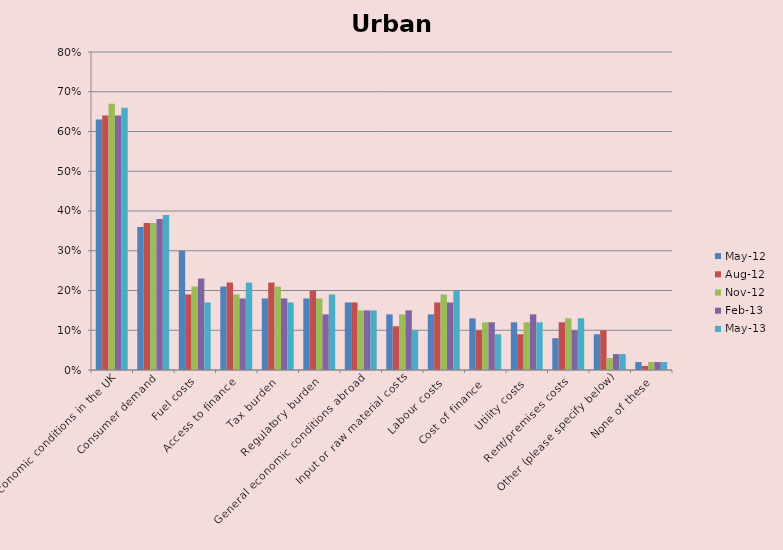
| Category | May-12 | Aug-12 | Nov-12 | Feb-13 | May-13 |
|---|---|---|---|---|---|
| General economic conditions in the UK  | 0.63 | 0.64 | 0.67 | 0.64 | 0.66 |
| Consumer demand | 0.36 | 0.37 | 0.37 | 0.38 | 0.39 |
| Fuel costs | 0.3 | 0.19 | 0.21 | 0.23 | 0.17 |
| Access to finance | 0.21 | 0.22 | 0.19 | 0.18 | 0.22 |
| Tax burden | 0.18 | 0.22 | 0.21 | 0.18 | 0.17 |
| Regulatory burden | 0.18 | 0.2 | 0.18 | 0.14 | 0.19 |
| General economic conditions abroad  | 0.17 | 0.17 | 0.15 | 0.15 | 0.15 |
| Input or raw material costs | 0.14 | 0.11 | 0.14 | 0.15 | 0.1 |
| Labour costs | 0.14 | 0.17 | 0.19 | 0.17 | 0.2 |
| Cost of finance  | 0.13 | 0.1 | 0.12 | 0.12 | 0.09 |
| Utility costs | 0.12 | 0.09 | 0.12 | 0.14 | 0.12 |
| Rent/premises costs | 0.08 | 0.12 | 0.13 | 0.1 | 0.13 |
| Other (please specify below) | 0.09 | 0.1 | 0.03 | 0.04 | 0.04 |
| None of these | 0.02 | 0.01 | 0.02 | 0.02 | 0.02 |